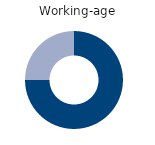
| Category | Working-age |
|---|---|
| Full-time | 75 |
| Part-time | 25 |